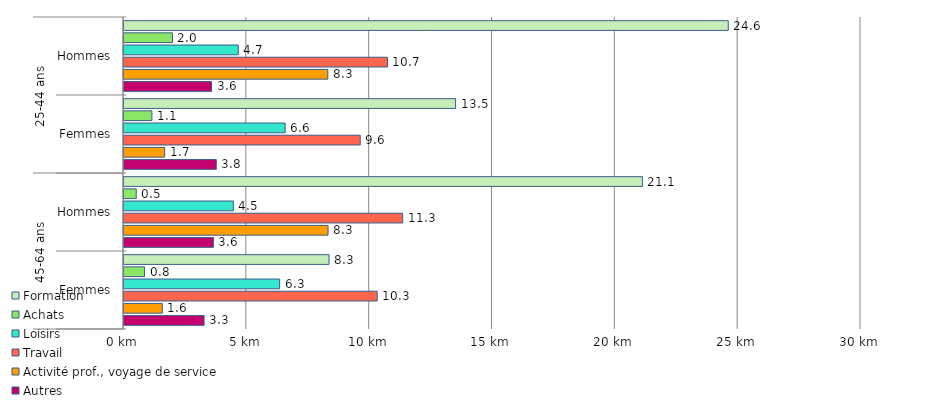
| Category | Formation | Achats | Loisirs | Travail | Activité prof., voyage de service | Autres |
|---|---|---|---|---|---|---|
| 0 | 24.596 | 1.972 | 4.651 | 10.725 | 8.296 | 3.562 |
| 1 | 13.498 | 1.136 | 6.56 | 9.616 | 1.655 | 3.757 |
| 2 | 21.102 | 0.498 | 4.452 | 11.342 | 8.305 | 3.64 |
| 3 | 8.346 | 0.836 | 6.335 | 10.306 | 1.559 | 3.26 |